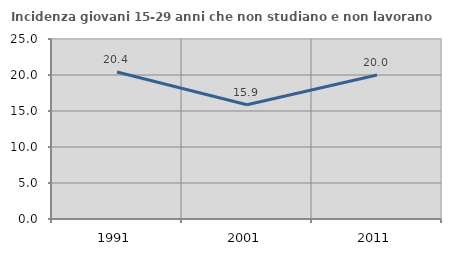
| Category | Incidenza giovani 15-29 anni che non studiano e non lavorano  |
|---|---|
| 1991.0 | 20.408 |
| 2001.0 | 15.861 |
| 2011.0 | 20 |